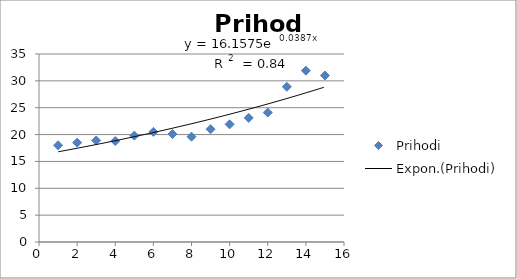
| Category | Prihodi |
|---|---|
| 1.0 | 18 |
| 2.0 | 18.5 |
| 3.0 | 18.9 |
| 4.0 | 18.8 |
| 5.0 | 19.8 |
| 6.0 | 20.5 |
| 7.0 | 20.1 |
| 8.0 | 19.6 |
| 9.0 | 21 |
| 10.0 | 21.9 |
| 11.0 | 23.1 |
| 12.0 | 24.1 |
| 13.0 | 28.9 |
| 14.0 | 31.9 |
| 15.0 | 31 |